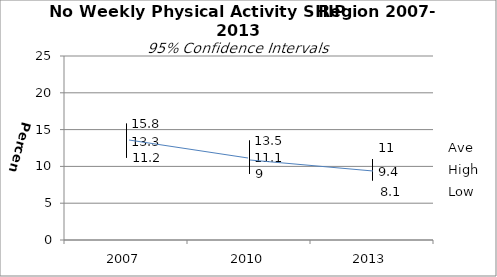
| Category | Ave | High | Low |
|---|---|---|---|
| 2007.0 | 13.3 | 15.8 | 11.2 |
| 2010.0 | 11.1 | 13.5 | 9 |
| 2013.0 | 9.4 | 11 | 8.1 |